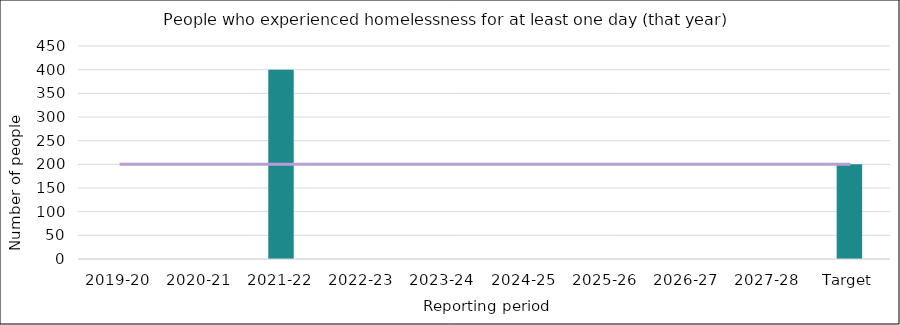
| Category | Series 0 |
|---|---|
| 2019-20 | 0 |
| 2020-21 | 0 |
| 2021-22 | 400 |
| 2022-23 | 0 |
| 2023-24 | 0 |
| 2024-25 | 0 |
| 2025-26 | 0 |
| 2026-27 | 0 |
| 2027-28 | 0 |
| Target | 200 |